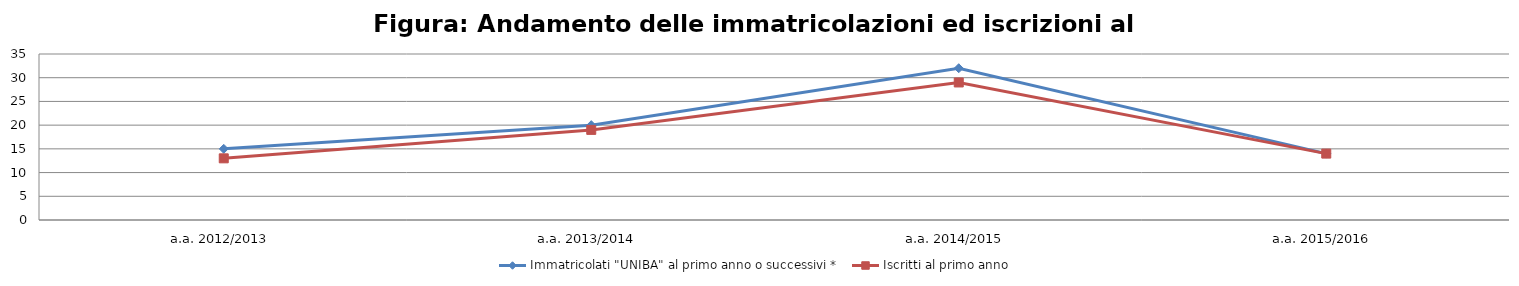
| Category | Immatricolati "UNIBA" al primo anno o successivi * | Iscritti al primo anno  |
|---|---|---|
| a.a. 2012/2013 | 15 | 13 |
| a.a. 2013/2014 | 20 | 19 |
| a.a. 2014/2015 | 32 | 29 |
| a.a. 2015/2016 | 14 | 14 |